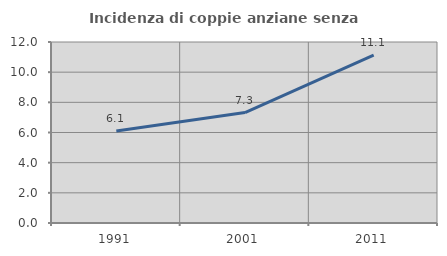
| Category | Incidenza di coppie anziane senza figli  |
|---|---|
| 1991.0 | 6.101 |
| 2001.0 | 7.324 |
| 2011.0 | 11.123 |